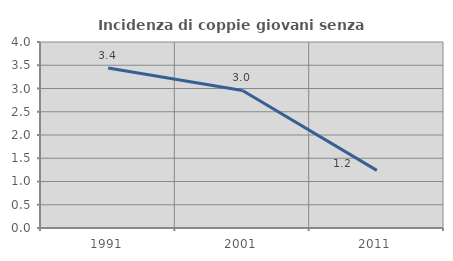
| Category | Incidenza di coppie giovani senza figli |
|---|---|
| 1991.0 | 3.442 |
| 2001.0 | 2.957 |
| 2011.0 | 1.24 |